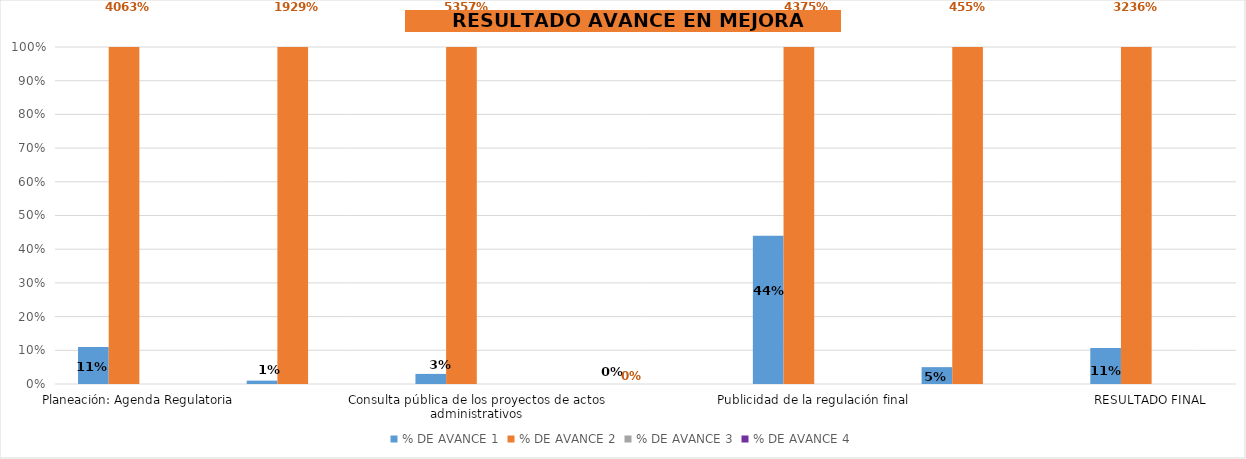
| Category | % DE AVANCE 1 | % DE AVANCE 2 | % DE AVANCE 3 | % DE AVANCE 4 |
|---|---|---|---|---|
| Planeación: Agenda Regulatoria | 0.11 | 40.625 |  |  |
| Diseño de la regulación: Análisis de Impacto Normativo (AIN) | 0.01 | 19.286 |  |  |
| Consulta pública de los proyectos de actos administrativos | 0.03 | 53.571 |  |  |
| Revisión de calidad normativa | 0 | 0 |  |  |
| Publicidad de la regulación final | 0.44 | 43.75 |  |  |
| Evaluación de las regulaciones






 | 0.05 | 4.545 |  |  |
| RESULTADO FINAL | 0.107 | 32.356 |  |  |